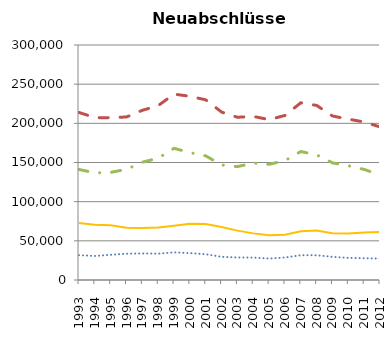
| Category | Produktionsberufe | Dienstleistungsberufe | primäre Dienstleistungs-berufe | sekundäre Dienstleistungsberufe |
|---|---|---|---|---|
| 1993.0 | 31677 | 213897 | 141105 | 72792 |
| 1994.0 | 30660 | 207270 | 136701 | 70569 |
| 1995.0 | 32193 | 207198 | 137424 | 69774 |
| 1996.0 | 33555 | 208137 | 141303 | 66834 |
| 1997.0 | 33918 | 216624 | 150378 | 66246 |
| 1998.0 | 33645 | 222636 | 155571 | 67065 |
| 1999.0 | 35277 | 237336 | 168075 | 69258 |
| 2000.0 | 34329 | 234501 | 162693 | 71808 |
| 2001.0 | 32901 | 230004 | 158478 | 71526 |
| 2002.0 | 29571 | 214413 | 146841 | 67569 |
| 2003.0 | 28767 | 207750 | 144738 | 63012 |
| 2004.0 | 28644 | 208827 | 149316 | 59511 |
| 2005.0 | 27363 | 204768 | 147675 | 57093 |
| 2006.0 | 28716 | 210054 | 152385 | 57669 |
| 2007.0 | 31644 | 226191 | 164001 | 62190 |
| 2008.0 | 31578 | 222885 | 159720 | 63165 |
| 2009.0 | 29556 | 209379 | 149550 | 59829 |
| 2010.0 | 28212 | 205338 | 145881 | 59457 |
| 2011.0 | 27795 | 201693 | 141159 | 60534 |
| 2012.0 | 27348 | 195405 | 134166 | 61239 |